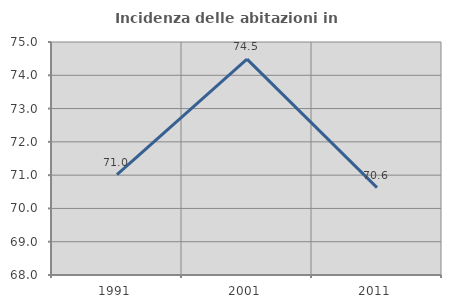
| Category | Incidenza delle abitazioni in proprietà  |
|---|---|
| 1991.0 | 71.019 |
| 2001.0 | 74.485 |
| 2011.0 | 70.626 |